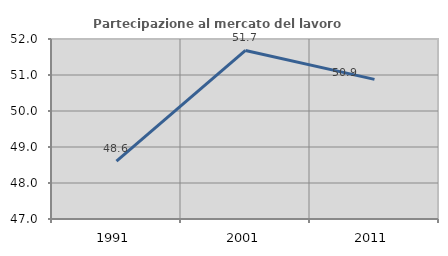
| Category | Partecipazione al mercato del lavoro  femminile |
|---|---|
| 1991.0 | 48.61 |
| 2001.0 | 51.683 |
| 2011.0 | 50.878 |